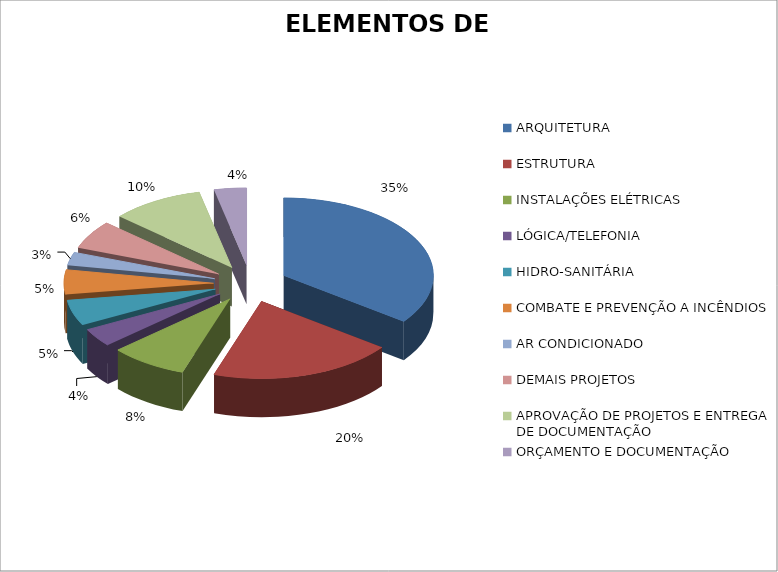
| Category | Series 0 |
|---|---|
| ARQUITETURA | 0.351 |
| ESTRUTURA | 0.2 |
| INSTALAÇÕES ELÉTRICAS | 0.083 |
| LÓGICA/TELEFONIA | 0.038 |
| HIDRO-SANITÁRIA | 0.053 |
| COMBATE E PREVENÇÃO A INCÊNDIOS | 0.051 |
| AR CONDICIONADO | 0.027 |
| DEMAIS PROJETOS | 0.06 |
| APROVAÇÃO DE PROJETOS E ENTREGA DE DOCUMENTAÇÃO | 0.1 |
| ORÇAMENTO E DOCUMENTAÇÃO | 0.035 |